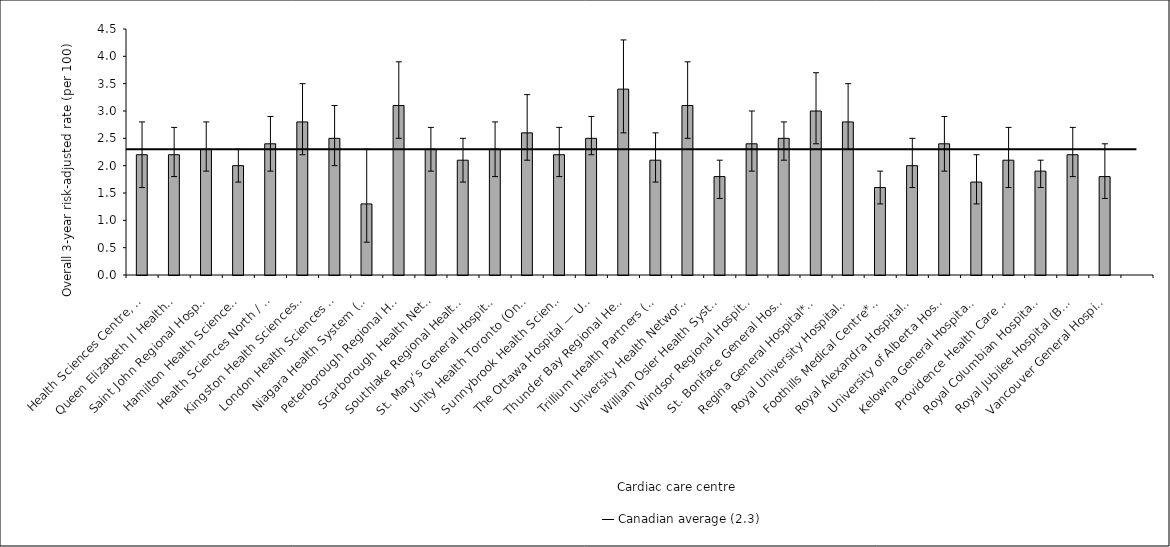
| Category | Risk-adjusted rate |
|---|---|
| Health Sciences Centre, St. John’s (N.L.) | 2.2 |
| Queen Elizabeth II Health Sciences Centre (N.S.) | 2.2 |
| Saint John Regional Hospital (N.B.) | 2.3 |
| Hamilton Health Sciences (Ont.) | 2 |
| Health Sciences North / Horizon Santé-Nord (Ont.) | 2.4 |
| Kingston Health Sciences Centre (Ont.) | 2.8 |
| London Health Sciences Centre (Ont.) | 2.5 |
| Niagara Health System (Ont.) | 1.3 |
| Peterborough Regional Health Centre* (Ont.) | 3.1 |
| Scarborough Health Network (Ont.) | 2.3 |
| Southlake Regional Health Centre (Ont.) | 2.1 |
| St. Mary’s General Hospital (Ont.) | 2.3 |
| Unity Health Toronto (Ont.) | 2.6 |
| Sunnybrook Health Sciences Centre (Ont.) | 2.2 |
| The Ottawa Hospital — University of Ottawa Heart Institute (Ont.) | 2.5 |
| Thunder Bay Regional Health Sciences Centre* (Ont.) | 3.4 |
| Trillium Health Partners (Ont.) | 2.1 |
| University Health Network* (Ont.) | 3.1 |
| William Osler Health System* (Ont.) | 1.8 |
| Windsor Regional Hospital (Ont.) | 2.4 |
| St. Boniface General Hospital (Man.) | 2.5 |
| Regina General Hospital* (Sask.) | 3 |
| Royal University Hospital (Sask.) | 2.8 |
| Foothills Medical Centre* (Alta.) | 1.6 |
| Royal Alexandra Hospital (Alta.) | 2 |
| University of Alberta Hospital (Alta.) | 2.4 |
| Kelowna General Hospital* (B.C.) | 1.7 |
| Providence Health Care — St. Paul’s Hospital (Vancouver) (B.C.) | 2.1 |
| Royal Columbian Hospital* (B.C.) | 1.9 |
| Royal Jubilee Hospital (B.C.) | 2.2 |
| Vancouver General Hospital (B.C.) | 1.8 |